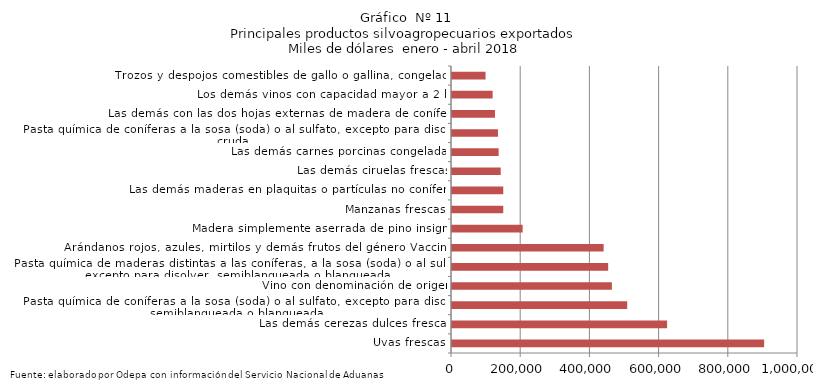
| Category | Series 0 |
|---|---|
| Uvas frescas | 902063.315 |
| Las demás cerezas dulces frescas | 621648.541 |
| Pasta química de coníferas a la sosa (soda) o al sulfato, excepto para disolver, semiblanqueada o blanqueada | 506372.665 |
| Vino con denominación de origen | 462076.8 |
| Pasta química de maderas distintas a las coníferas, a la sosa (soda) o al sulfato, excepto para disolver, semiblanqueada o blanqueada | 451344.412 |
| Arándanos rojos, azules, mirtilos y demás frutos del género Vaccinium | 438299.994 |
| Madera simplemente aserrada de pino insigne | 204133.815 |
| Manzanas frescas | 148177.683 |
| Las demás maderas en plaquitas o partículas no coníferas | 148160.417 |
| Las demás ciruelas frescas | 140759.71 |
| Las demás carnes porcinas congeladas | 134783.239 |
| Pasta química de coníferas a la sosa (soda) o al sulfato, excepto para disolver, cruda | 132904.057 |
| Las demás con las dos hojas externas de madera de coníferas | 124221.659 |
| Los demás vinos con capacidad mayor a 2 lts | 117440.209 |
| Trozos y despojos comestibles de gallo o gallina, congelados | 96936.728 |